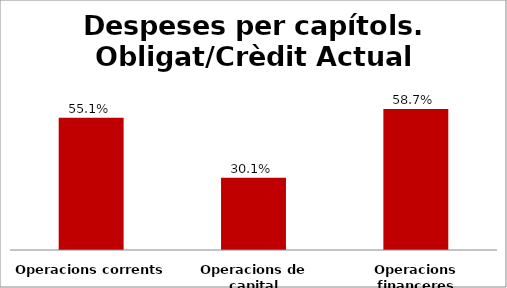
| Category | Series 0 |
|---|---|
| Operacions corrents | 0.551 |
| Operacions de capital | 0.301 |
| Operacions financeres | 0.587 |